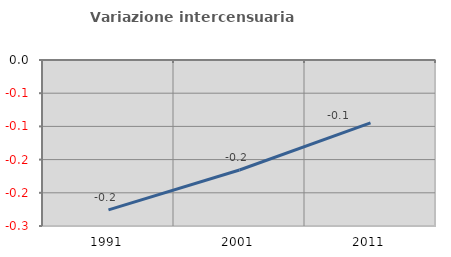
| Category | Variazione intercensuaria annua |
|---|---|
| 1991.0 | -0.226 |
| 2001.0 | -0.166 |
| 2011.0 | -0.095 |